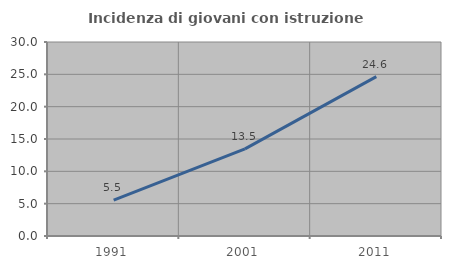
| Category | Incidenza di giovani con istruzione universitaria |
|---|---|
| 1991.0 | 5.534 |
| 2001.0 | 13.468 |
| 2011.0 | 24.643 |